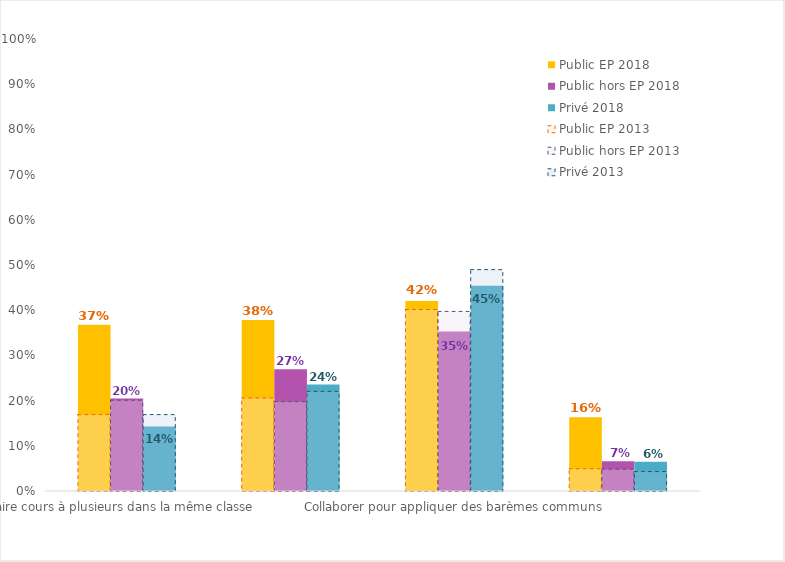
| Category | Public EP 2018 | Public hors EP 2018 | Privé 2018 |
|---|---|---|---|
| Faire cours à plusieurs dans la même classe   | 0.368 | 0.204 | 0.143 |
| Participer à des projets communs sur plusieurs classes | 0.379 | 0.27 | 0.236 |
| Collaborer pour appliquer des barèmes communs | 0.421 | 0.353 | 0.454 |
| Participer à des activités de formation professionnelle en groupe | 0.163 | 0.066 | 0.065 |